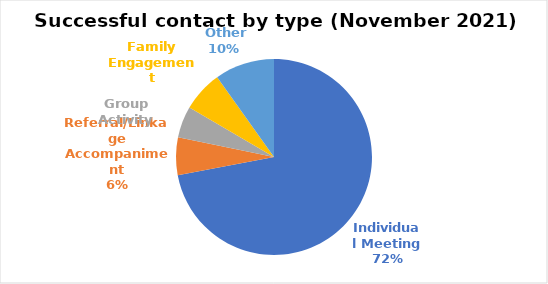
| Category | Series 0 |
|---|---|
| Individual Meeting | 139 |
| Referral/Linkage Accompaniment | 12 |
| Group Activity | 10 |
| Family Engagement | 13 |
|  Other | 19 |